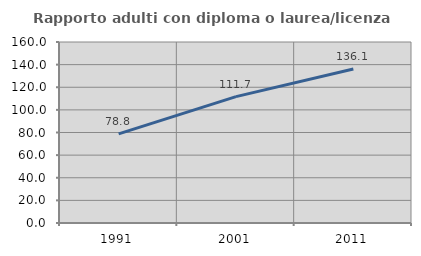
| Category | Rapporto adulti con diploma o laurea/licenza media  |
|---|---|
| 1991.0 | 78.834 |
| 2001.0 | 111.682 |
| 2011.0 | 136.1 |